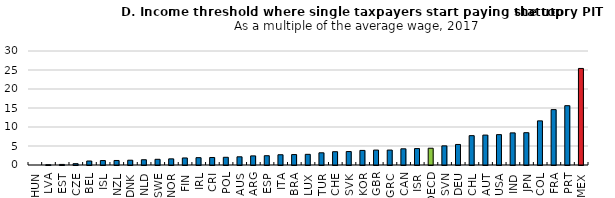
| Category | Threshold (expressed as a multiple of the average wage) |
|---|---|
| HUN | 0 |
| LVA | 0.074 |
| EST | 0.148 |
| CZE | 0.348 |
| BEL | 1.049 |
| ISL | 1.172 |
| NZL | 1.19 |
| DNK | 1.261 |
| NLD | 1.385 |
| SWE | 1.498 |
| NOR | 1.617 |
| FIN | 1.852 |
| IRL | 1.929 |
| CRI | 1.974 |
| POL | 2.031 |
| AUS | 2.155 |
| ARG | 2.399 |
| ESP | 2.444 |
| ITA | 2.7 |
| BRA | 2.744 |
| LUX | 2.806 |
| TUR | 3.211 |
| CHE | 3.497 |
| SVK | 3.54 |
| KOR | 3.839 |
| GBR | 3.926 |
| GRC | 3.928 |
| CAN | 4.26 |
| ISR | 4.325 |
| OECD | 4.409 |
| SVN | 5.039 |
| DEU | 5.403 |
| CHL | 7.726 |
| AUT | 7.872 |
| USA | 7.993 |
| IND | 8.453 |
| JPN | 8.502 |
| COL | 11.616 |
| FRA | 14.576 |
| PRT | 15.612 |
| MEX | 25.409 |